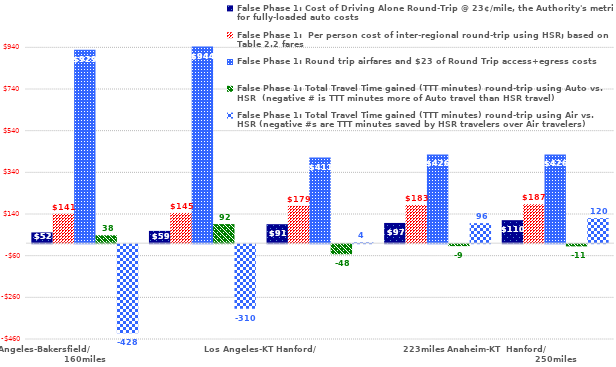
| Category | False Phase 1: Cost of Driving Alone Round-Trip @ 23¢/mile, the Authority's metric for fully-loaded auto costs | False Phase 1:  Per person cost of inter-regional round-trip using HSR; based on Table 2.2 fares | False Phase 1: Round trip airfares and $23 of Round Trip access+egress costs | False Phase 1: Total Travel Time gained (TTT minutes) round-trip using Auto vs. HSR  (negative # is TTT minutes more of Auto travel than HSR travel) | False Phase 1: Total Travel Time gained (TTT minutes) round-trip using Air vs. HSR (negative #s are TTT minutes saved by HSR travelers over Air travelers) |
|---|---|---|---|---|---|
| Los Angeles-Bakersfield/                                     160miles | 51.52 | 141 | 929 | 37.9 | -428 |
| OC Gateway-Bakersfield/                                           174miles | 58.88 | 145 | 944 | 91.5 | -310 |
| Los Angeles-KT Hanford/                             223miles | 91.08 | 179 | 411 | -48.4 | 4 |
| OC Gateway-KT Hanford/                                 237miles | 97.06 | 183 | 426 | -9.3 | 96 |
| Anaheim-KT  Hanford/                                           250miles | 110.4 | 187 | 426 | -10.6 | 120 |